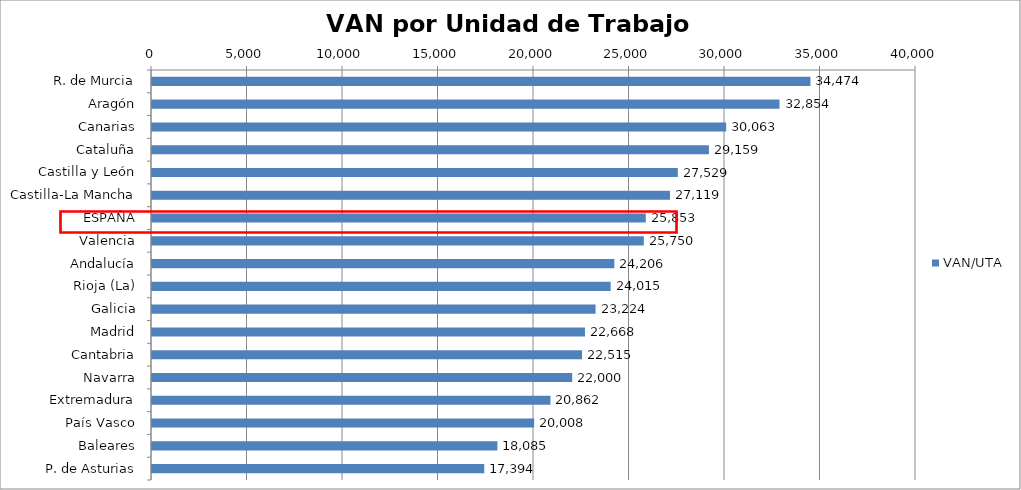
| Category | VAN/UTA |
|---|---|
| R. de Murcia | 34473.871 |
| Aragón | 32853.713 |
| Canarias | 30062.969 |
| Cataluña | 29159.317 |
| Castilla y León | 27529.03 |
| Castilla-La Mancha | 27119.292 |
| ESPAÑA | 25853 |
| Valencia | 25749.616 |
| Andalucía | 24205.818 |
| Rioja (La) | 24015.197 |
| Galicia | 23224.276 |
| Madrid | 22668.318 |
| Cantabria | 22514.754 |
| Navarra | 22000.215 |
| Extremadura | 20862.175 |
| País Vasco | 20008.428 |
| Baleares | 18084.596 |
| P. de Asturias | 17394.042 |